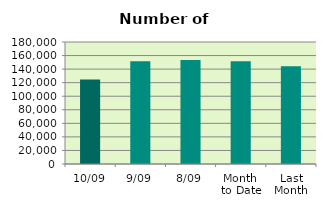
| Category | Series 0 |
|---|---|
| 10/09 | 124614 |
| 9/09 | 151502 |
| 8/09 | 153494 |
| Month 
to Date | 151651.25 |
| Last
Month | 144368.095 |